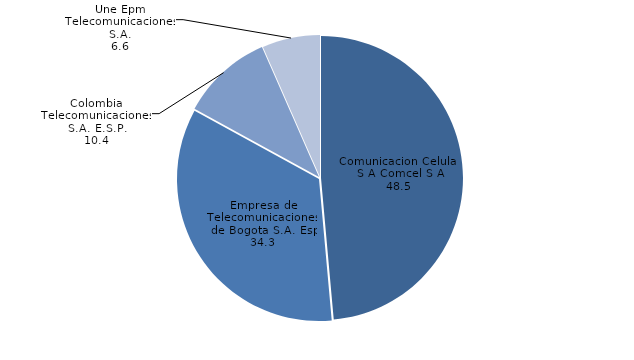
| Category | Series 0 |
|---|---|
| Comunicacion Celular S A Comcel S A | 48.471 |
| Empresa de Telecomunicaciones de Bogota S.A. Esp | 34.344 |
| Colombia Telecomunicaciones S.A. E.S.P. | 10.415 |
| Une Epm Telecomunicaciones S.A. | 6.567 |